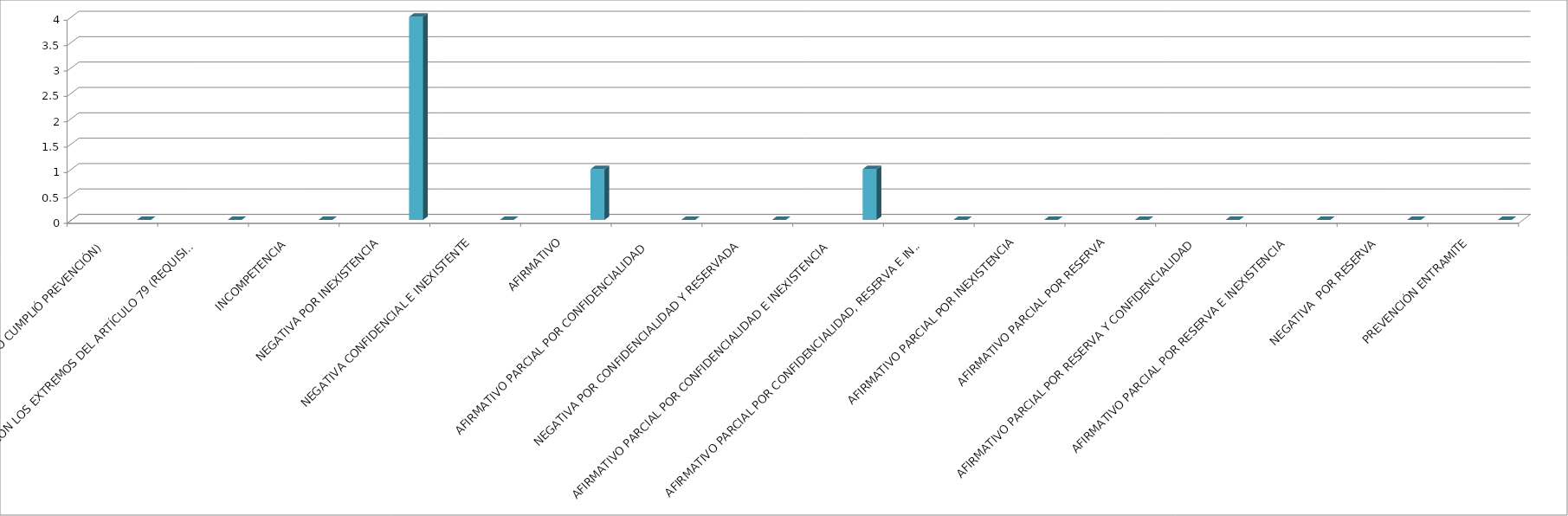
| Category | Series 0 | Series 1 | Series 2 | Series 3 | Series 4 |
|---|---|---|---|---|---|
| SE TIENE POR NO PRESENTADA ( NO CUMPLIÓ PREVENCIÓN) |  |  |  |  | 0 |
| NO CUMPLIO CON LOS EXTREMOS DEL ARTÍCULO 79 (REQUISITOS) |  |  |  |  | 0 |
| INCOMPETENCIA  |  |  |  |  | 0 |
| NEGATIVA POR INEXISTENCIA |  |  |  |  | 4 |
| NEGATIVA CONFIDENCIAL E INEXISTENTE |  |  |  |  | 0 |
| AFIRMATIVO |  |  |  |  | 1 |
| AFIRMATIVO PARCIAL POR CONFIDENCIALIDAD  |  |  |  |  | 0 |
| NEGATIVA POR CONFIDENCIALIDAD Y RESERVADA |  |  |  |  | 0 |
| AFIRMATIVO PARCIAL POR CONFIDENCIALIDAD E INEXISTENCIA |  |  |  |  | 1 |
| AFIRMATIVO PARCIAL POR CONFIDENCIALIDAD, RESERVA E INEXISTENCIA |  |  |  |  | 0 |
| AFIRMATIVO PARCIAL POR INEXISTENCIA |  |  |  |  | 0 |
| AFIRMATIVO PARCIAL POR RESERVA |  |  |  |  | 0 |
| AFIRMATIVO PARCIAL POR RESERVA Y CONFIDENCIALIDAD |  |  |  |  | 0 |
| AFIRMATIVO PARCIAL POR RESERVA E INEXISTENCIA |  |  |  |  | 0 |
| NEGATIVA  POR RESERVA |  |  |  |  | 0 |
| PREVENCIÓN ENTRAMITE |  |  |  |  | 0 |